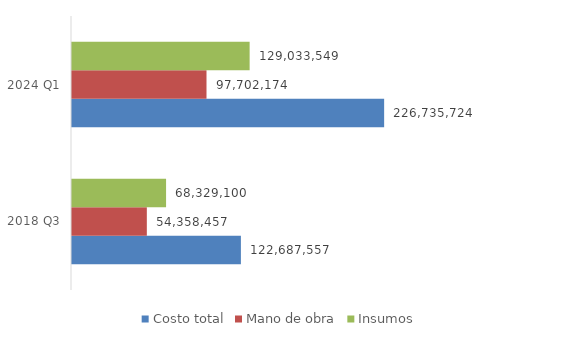
| Category | Costo total | Mano de obra | Insumos |
|---|---|---|---|
| 2018 Q3 | 122687557.143 | 54358457.143 | 68329100 |
| 2024 Q1 | 226735723.539 | 97702174.286 | 129033549.253 |